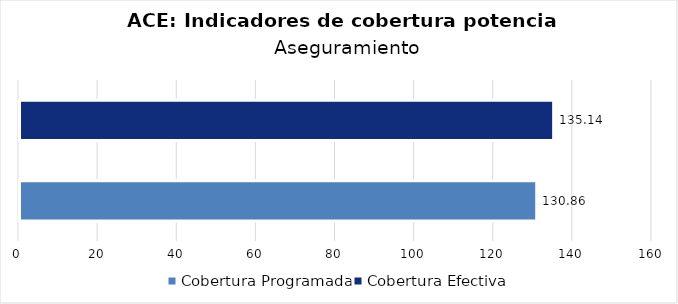
| Category | Aseguramiento |
|---|---|
| Cobertura Programada | 130.864 |
| Cobertura Efectiva | 135.141 |